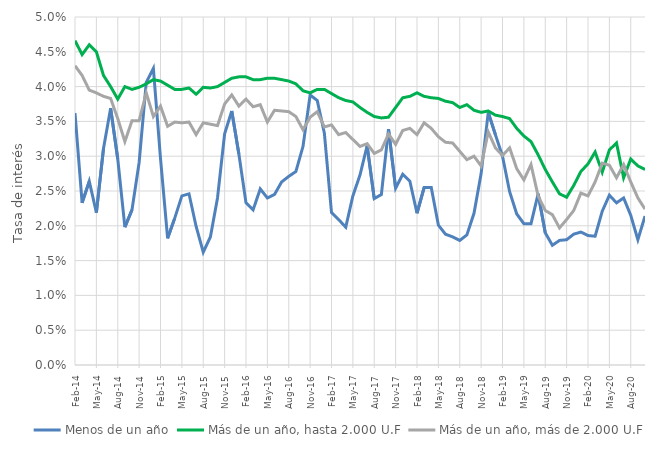
| Category | Menos de un año | Más de un año, hasta 2.000 U.F | Más de un año, más de 2.000 U.F |
|---|---|---|---|
| 2014-02-01 | 0.036 | 0.047 | 0.043 |
| 2014-03-01 | 0.023 | 0.045 | 0.042 |
| 2014-04-01 | 0.026 | 0.046 | 0.04 |
| 2014-05-01 | 0.022 | 0.045 | 0.039 |
| 2014-06-01 | 0.031 | 0.042 | 0.039 |
| 2014-07-01 | 0.037 | 0.04 | 0.038 |
| 2014-08-01 | 0.03 | 0.038 | 0.035 |
| 2014-09-01 | 0.02 | 0.04 | 0.032 |
| 2014-10-01 | 0.022 | 0.04 | 0.035 |
| 2014-11-01 | 0.029 | 0.04 | 0.035 |
| 2014-12-01 | 0.041 | 0.04 | 0.039 |
| 2015-01-01 | 0.043 | 0.041 | 0.036 |
| 2015-02-01 | 0.03 | 0.041 | 0.037 |
| 2015-03-01 | 0.018 | 0.04 | 0.034 |
| 2015-04-01 | 0.021 | 0.04 | 0.035 |
| 2015-05-01 | 0.024 | 0.04 | 0.035 |
| 2015-06-01 | 0.025 | 0.04 | 0.035 |
| 2015-07-01 | 0.02 | 0.039 | 0.033 |
| 2015-08-01 | 0.016 | 0.04 | 0.035 |
| 2015-09-01 | 0.018 | 0.04 | 0.035 |
| 2015-10-01 | 0.024 | 0.04 | 0.034 |
| 2015-11-01 | 0.033 | 0.041 | 0.038 |
| 2015-12-01 | 0.036 | 0.041 | 0.039 |
| 2016-01-01 | 0.03 | 0.041 | 0.037 |
| 2016-02-01 | 0.023 | 0.041 | 0.038 |
| 2016-03-01 | 0.022 | 0.041 | 0.037 |
| 2016-04-01 | 0.025 | 0.041 | 0.037 |
| 2016-05-01 | 0.024 | 0.041 | 0.035 |
| 2016-06-01 | 0.024 | 0.041 | 0.037 |
| 2016-07-01 | 0.026 | 0.041 | 0.036 |
| 2016-08-01 | 0.027 | 0.041 | 0.036 |
| 2016-09-01 | 0.028 | 0.04 | 0.036 |
| 2016-10-01 | 0.031 | 0.039 | 0.034 |
| 2016-11-01 | 0.039 | 0.039 | 0.036 |
| 2016-12-01 | 0.038 | 0.04 | 0.036 |
| 2017-01-01 | 0.033 | 0.04 | 0.034 |
| 2017-02-01 | 0.022 | 0.039 | 0.034 |
| 2017-03-01 | 0.021 | 0.038 | 0.033 |
| 2017-04-01 | 0.02 | 0.038 | 0.033 |
| 2017-05-01 | 0.024 | 0.038 | 0.032 |
| 2017-06-01 | 0.027 | 0.037 | 0.031 |
| 2017-07-01 | 0.032 | 0.036 | 0.032 |
| 2017-08-01 | 0.024 | 0.036 | 0.03 |
| 2017-09-01 | 0.024 | 0.036 | 0.031 |
| 2017-10-01 | 0.034 | 0.036 | 0.033 |
| 2017-11-01 | 0.025 | 0.037 | 0.032 |
| 2017-12-01 | 0.027 | 0.038 | 0.034 |
| 2018-01-01 | 0.026 | 0.039 | 0.034 |
| 2018-02-01 | 0.022 | 0.039 | 0.033 |
| 2018-03-01 | 0.026 | 0.039 | 0.035 |
| 2018-04-01 | 0.026 | 0.038 | 0.034 |
| 2018-05-01 | 0.02 | 0.038 | 0.033 |
| 2018-06-01 | 0.019 | 0.038 | 0.032 |
| 2018-07-01 | 0.018 | 0.038 | 0.032 |
| 2018-08-01 | 0.018 | 0.037 | 0.031 |
| 2018-09-01 | 0.019 | 0.037 | 0.03 |
| 2018-10-01 | 0.022 | 0.037 | 0.03 |
| 2018-11-01 | 0.028 | 0.036 | 0.029 |
| 2018-12-01 | 0.036 | 0.036 | 0.034 |
| 2019-01-01 | 0.033 | 0.036 | 0.031 |
| 2019-02-01 | 0.03 | 0.036 | 0.03 |
| 2019-03-01 | 0.025 | 0.035 | 0.031 |
| 2019-04-01 | 0.022 | 0.034 | 0.028 |
| 2019-05-01 | 0.02 | 0.033 | 0.027 |
| 2019-06-01 | 0.02 | 0.032 | 0.029 |
| 2019-07-01 | 0.025 | 0.03 | 0.024 |
| 2019-08-01 | 0.019 | 0.028 | 0.022 |
| 2019-09-01 | 0.017 | 0.026 | 0.022 |
| 2019-10-01 | 0.018 | 0.025 | 0.02 |
| 2019-11-01 | 0.018 | 0.024 | 0.021 |
| 2019-12-01 | 0.019 | 0.026 | 0.022 |
| 2020-01-01 | 0.019 | 0.028 | 0.025 |
| 2020-02-01 | 0.019 | 0.029 | 0.024 |
| 2020-03-01 | 0.018 | 0.031 | 0.026 |
| 2020-04-01 | 0.022 | 0.028 | 0.029 |
| 2020-05-01 | 0.024 | 0.031 | 0.029 |
| 2020-06-01 | 0.023 | 0.032 | 0.027 |
| 2020-07-01 | 0.024 | 0.027 | 0.029 |
| 2020-08-01 | 0.022 | 0.03 | 0.026 |
| 2020-09-01 | 0.018 | 0.029 | 0.024 |
| 2020-10-01 | 0.021 | 0.028 | 0.022 |